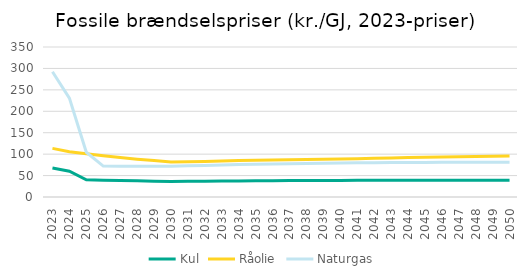
| Category | Kul | Råolie | Naturgas |
|---|---|---|---|
| 2023.0 | 67.69 | 113.43 | 292.39 |
| 2024.0 | 60.2 | 105.81 | 230.81 |
| 2025.0 | 40.19 | 100.87 | 104.35 |
| 2026.0 | 39.34 | 96.19 | 72.06 |
| 2027.0 | 38.52 | 92.03 | 71.91 |
| 2028.0 | 37.71 | 88.18 | 71.72 |
| 2029.0 | 36.97 | 84.92 | 71.65 |
| 2030.0 | 36.24 | 81.6 | 71.55 |
| 2031.0 | 36.62 | 82.08 | 72.71 |
| 2032.0 | 36.97 | 83.09 | 73.78 |
| 2033.0 | 37.3 | 84.03 | 74.77 |
| 2034.0 | 37.6 | 84.91 | 75.69 |
| 2035.0 | 37.89 | 85.77 | 76.59 |
| 2036.0 | 38.09 | 86.42 | 77.24 |
| 2037.0 | 38.28 | 87.01 | 77.83 |
| 2038.0 | 38.44 | 87.56 | 78.37 |
| 2039.0 | 38.59 | 88.05 | 78.85 |
| 2040.0 | 38.74 | 88.54 | 79.33 |
| 2041.0 | 38.85 | 89.28 | 79.71 |
| 2042.0 | 38.94 | 90.22 | 80.03 |
| 2043.0 | 39.01 | 91.11 | 80.31 |
| 2044.0 | 39.08 | 91.93 | 80.55 |
| 2045.0 | 39.14 | 92.73 | 80.78 |
| 2046.0 | 39.18 | 93.44 | 80.94 |
| 2047.0 | 39.2 | 94.09 | 81.06 |
| 2048.0 | 39.2 | 94.68 | 81.13 |
| 2049.0 | 39.2 | 95.23 | 81.17 |
| 2050.0 | 39.19 | 95.73 | 81.18 |